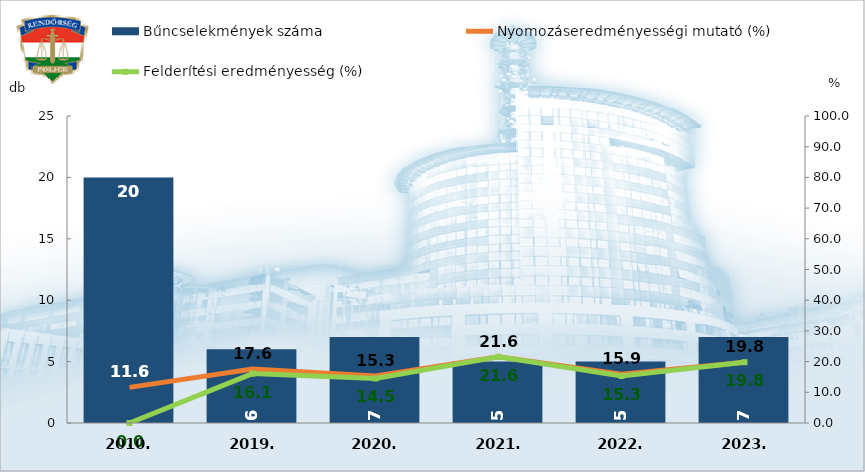
| Category | Bűncselekmények száma |
|---|---|
| 2010. | 20 |
| 2019. | 6 |
| 2020. | 7 |
| 2021. | 5 |
| 2022. | 5 |
| 2023. | 7 |